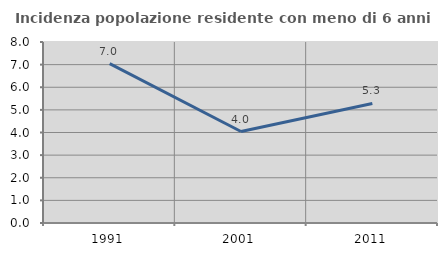
| Category | Incidenza popolazione residente con meno di 6 anni |
|---|---|
| 1991.0 | 7.045 |
| 2001.0 | 4.044 |
| 2011.0 | 5.284 |